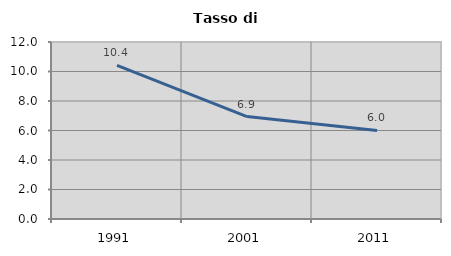
| Category | Tasso di disoccupazione   |
|---|---|
| 1991.0 | 10.417 |
| 2001.0 | 6.944 |
| 2011.0 | 6.002 |